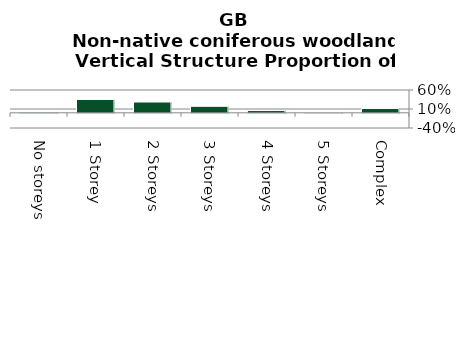
| Category | Non-native coniferous woodland |
|---|---|
| No storeys | 0.015 |
| 1 Storey | 0.351 |
| 2 Storeys | 0.284 |
| 3 Storeys | 0.17 |
| 4 Storeys | 0.059 |
| 5 Storeys | 0.009 |
| Complex | 0.112 |